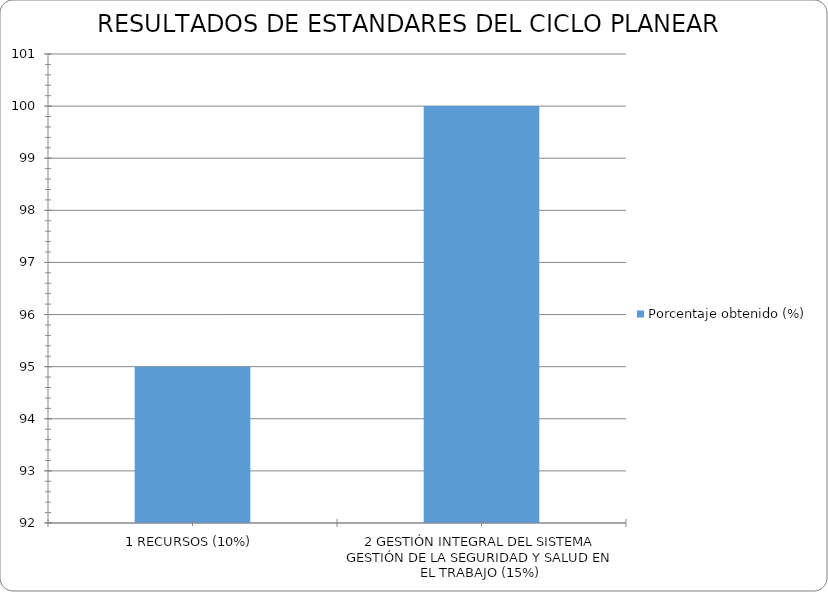
| Category | Porcentaje obtenido (%) |
|---|---|
| 1 RECURSOS (10%) | 95 |
| 2 GESTIÓN INTEGRAL DEL SISTEMA GESTIÓN DE LA SEGURIDAD Y SALUD EN EL TRABAJO (15%) | 100 |